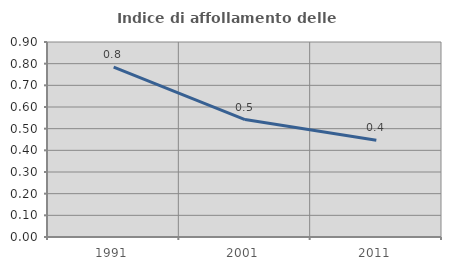
| Category | Indice di affollamento delle abitazioni  |
|---|---|
| 1991.0 | 0.784 |
| 2001.0 | 0.542 |
| 2011.0 | 0.447 |